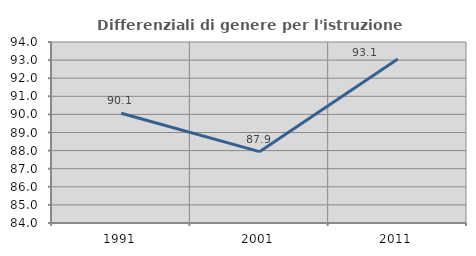
| Category | Differenziali di genere per l'istruzione superiore |
|---|---|
| 1991.0 | 90.061 |
| 2001.0 | 87.943 |
| 2011.0 | 93.055 |